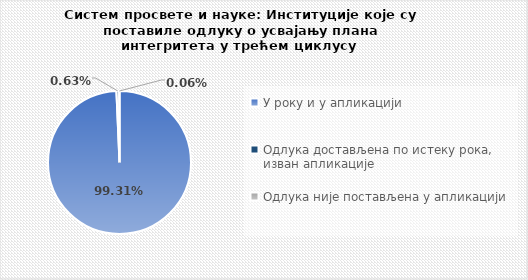
| Category | Series 0 |
|---|---|
| У року и у апликацији | 0.993 |
| Одлука достављена по истеку рока, изван апликације | 0.006 |
| Одлука није постављена у апликацији | 0.001 |